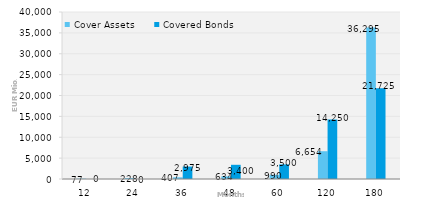
| Category | Cover Assets | Covered Bonds |
|---|---|---|
| 12.0 | 77.237 | 0 |
| 24.0 | 228.326 | 0 |
| 36.0 | 407.404 | 2975 |
| 48.0 | 633.576 | 3400 |
| 60.0 | 989.72 | 3500 |
| 120.0 | 6654.062 | 14250 |
| 180.0 | 36294.854 | 21725 |